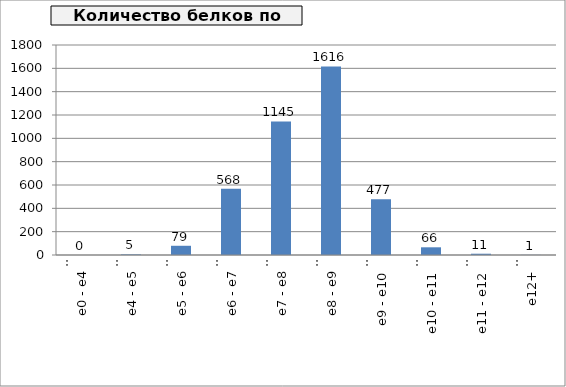
| Category | number of proteins |
|---|---|
| 0 | 0 |
| 1 | 5 |
| 2 | 79 |
| 3 | 568 |
| 4 | 1145 |
| 5 | 1616 |
| 6 | 477 |
| 7 | 66 |
| 8 | 11 |
| 9 | 1 |